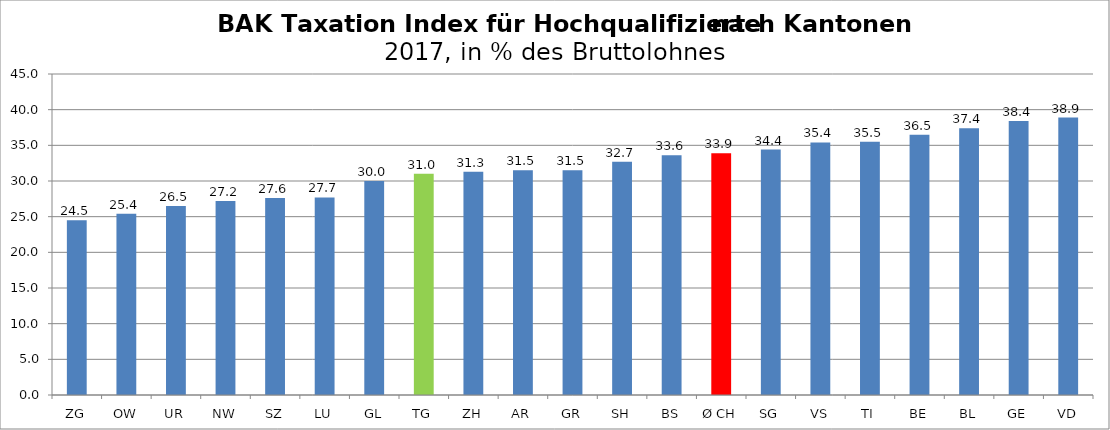
| Category | Series 0 |
|---|---|
| ZG | 24.5 |
| OW | 25.4 |
| UR | 26.5 |
| NW | 27.2 |
| SZ | 27.6 |
| LU | 27.7 |
| GL | 30 |
| TG | 31 |
| ZH | 31.3 |
| AR | 31.5 |
| GR | 31.5 |
| SH | 32.7 |
| BS | 33.6 |
| Ø CH | 33.9 |
| SG | 34.4 |
| VS | 35.4 |
| TI | 35.5 |
| BE | 36.5 |
| BL | 37.4 |
| GE | 38.4 |
| VD | 38.9 |